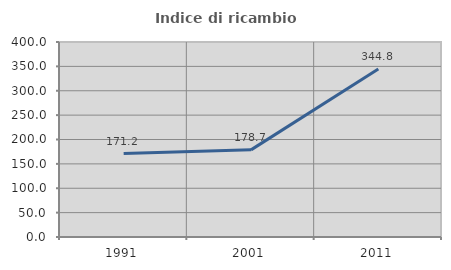
| Category | Indice di ricambio occupazionale  |
|---|---|
| 1991.0 | 171.154 |
| 2001.0 | 178.723 |
| 2011.0 | 344.828 |